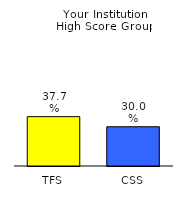
| Category | Series 0 |
|---|---|
| TFS | 0.377 |
| CSS | 0.3 |